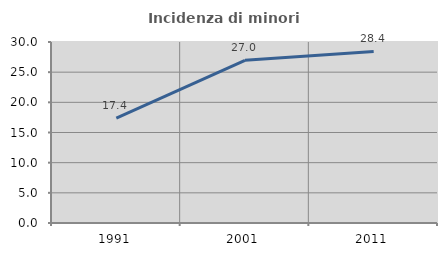
| Category | Incidenza di minori stranieri |
|---|---|
| 1991.0 | 17.391 |
| 2001.0 | 26.966 |
| 2011.0 | 28.431 |